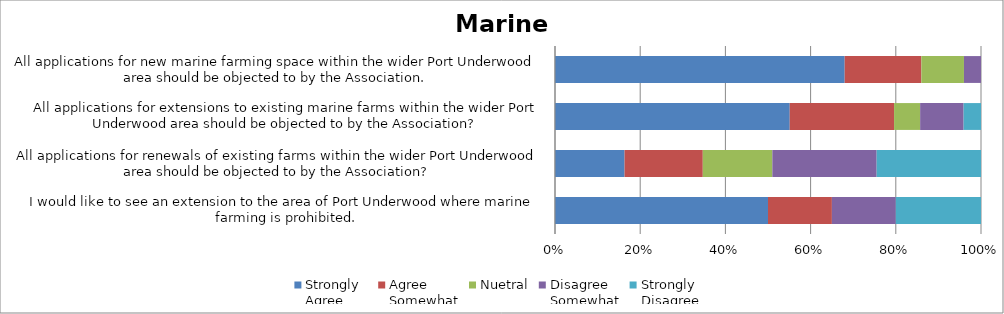
| Category | Strongly
Agree | Agree
Somewhat | Nuetral | Disagree
Somewhat | Strongly
Disagree |
|---|---|---|---|---|---|
| bI would like to see an extension to the area of Port Underwood where marine farming is prohibited. | 20 | 6 | 0 | 6 | 8 |
| ~All applications for renewals of existing farms within the wider Port Underwood area should be objected to by the Association? | 8 | 9 | 8 | 12 | 12 |
| All applications for extensions to existing marine farms within the wider Port Underwood area should be objected to by the Association? | 27 | 12 | 3 | 5 | 2 |
| |All applications for new marine farming space within the wider Port Underwood area should be objected to by the Association. | 34 | 9 | 5 | 2 | 0 |